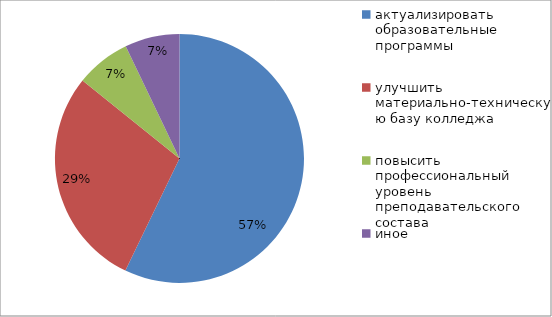
| Category | Series 0 |
|---|---|
| актуализировать образовательные программы  | 57.1 |
| улучшить материально-техническую базу колледжа | 28.6 |
| повысить профессиональный уровень преподавательского состава | 7.1 |
| иное | 7.1 |